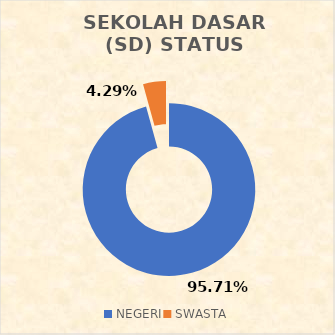
| Category | SEKOLAH DASAR (SD) STATUS SEKOLAH |
|---|---|
| NEGERI | 469 |
| SWASTA | 21 |